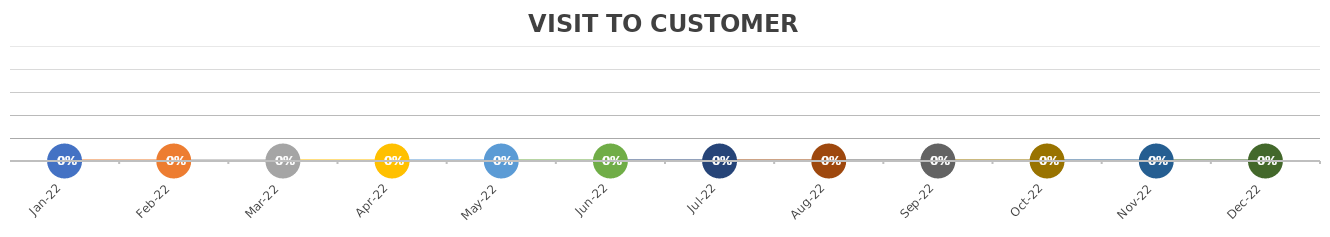
| Category | Series 0 |
|---|---|
| 2022-01-18 | 0 |
| 2022-02-18 | 0 |
| 2022-03-18 | 0 |
| 2022-04-18 | 0 |
| 2022-05-18 | 0 |
| 2022-06-18 | 0 |
| 2022-07-18 | 0 |
| 2022-08-18 | 0 |
| 2022-09-18 | 0 |
| 2022-10-18 | 0 |
| 2022-11-18 | 0 |
| 2022-12-18 | 0 |